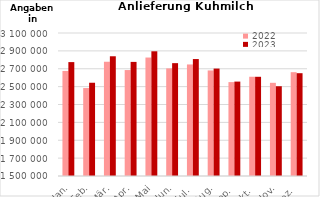
| Category | 2022 | 2023 |
|---|---|---|
| Jan. | 2675177.106 | 2774382.411 |
| Feb. | 2484121.716 | 2543432.372 |
| Mär. | 2778378.812 | 2839645.632 |
| Apr. | 2685441.716 | 2776676.837 |
| Mai | 2825561.243 | 2895424.25 |
| Jun. | 2703897.239 | 2762643.654 |
| Jul. | 2748053.561 | 2808531.242 |
| Aug. | 2680901.36 | 2701954.533 |
| Sep. | 2550612.998 | 2556397.834 |
| Okt. | 2610506.751 | 2610053.259 |
| Nov. | 2542665.322 | 2504303.487 |
| Dez. | 2661673.621 | 2650239.522 |